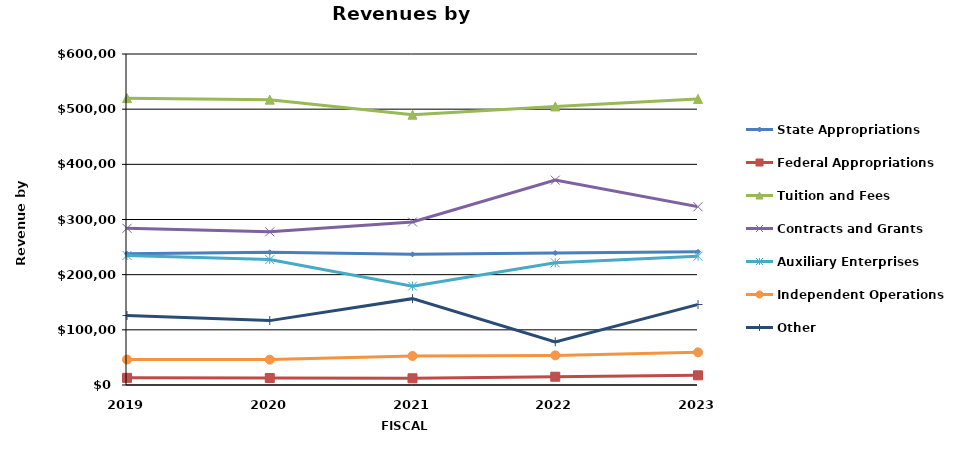
| Category | State Appropriations | Federal Appropriations | Tuition and Fees | Contracts and Grants | Auxiliary Enterprises | Independent Operations | Other |
|---|---|---|---|---|---|---|---|
| 2019.0 | 237884 | 12972 | 520006 | 284080 | 234846 | 46139 | 125959 |
| 2020.0 | 240526 | 12694 | 517257 | 277630 | 227374 | 45999 | 116706 |
| 2021.0 | 236784 | 12158 | 489989 | 295564 | 179212 | 52576 | 156510 |
| 2022.0 | 239318 | 14985 | 504955 | 371352 | 221433 | 53698 | 78098 |
| 2023.0 | 241374 | 17546 | 518652 | 323104 | 233423 | 59188 | 145861 |